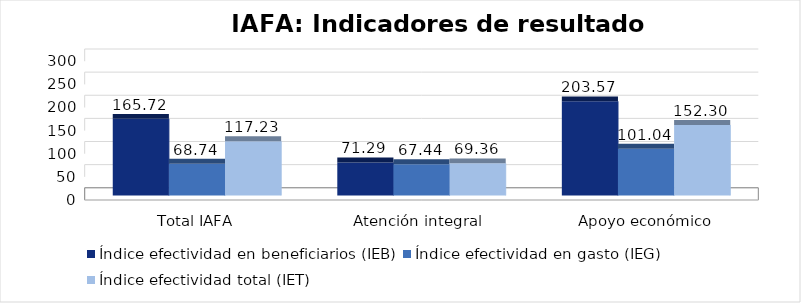
| Category | Índice efectividad en beneficiarios (IEB) | Índice efectividad en gasto (IEG)  | Índice efectividad total (IET) |
|---|---|---|---|
| Total IAFA | 165.722 | 68.744 | 117.233 |
| Atención integral  | 71.287 | 67.437 | 69.362 |
| Apoyo económico | 203.571 | 101.038 | 152.304 |